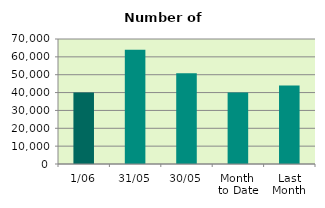
| Category | Series 0 |
|---|---|
| 1/06 | 40100 |
| 31/05 | 64012 |
| 30/05 | 50782 |
| Month 
to Date | 40100 |
| Last
Month | 44009.364 |